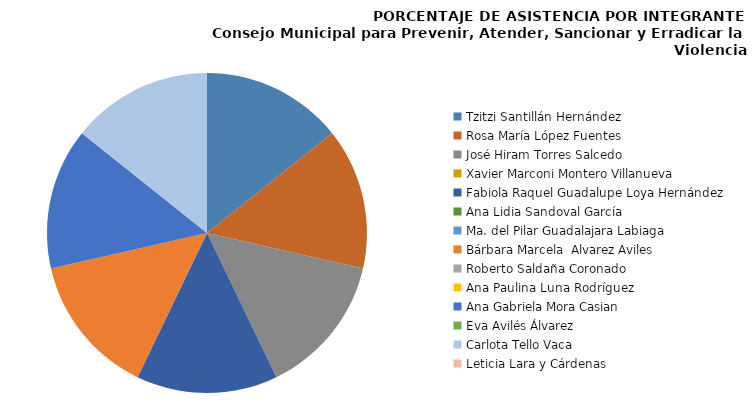
| Category | Series 0 |
|---|---|
| Tzitzi Santillán Hernández | 1 |
| Rosa María López Fuentes | 1 |
| José Hiram Torres Salcedo | 1 |
| Xavier Marconi Montero Villanueva | 0 |
| Fabiola Raquel Guadalupe Loya Hernández | 1 |
| Ana Lidia Sandoval García | 0 |
| Ma. del Pilar Guadalajara Labiaga | 0 |
| Bárbara Marcela  Alvarez Aviles  | 1 |
| Roberto Saldaña Coronado | 0 |
| Ana Paulina Luna Rodríguez | 0 |
| Ana Gabriela Mora Casian | 1 |
| Eva Avilés Álvarez | 0 |
| Carlota Tello Vaca | 1 |
| Leticia Lara y Cárdenas | 0 |